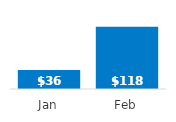
| Category | Net Profit |
|---|---|
| Jan | 36 |
| Feb | 118 |